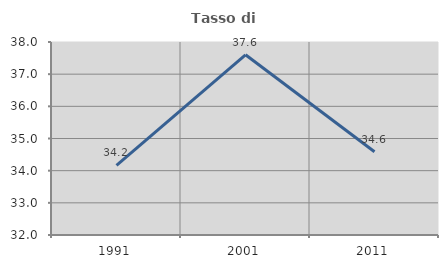
| Category | Tasso di occupazione   |
|---|---|
| 1991.0 | 34.161 |
| 2001.0 | 37.602 |
| 2011.0 | 34.59 |